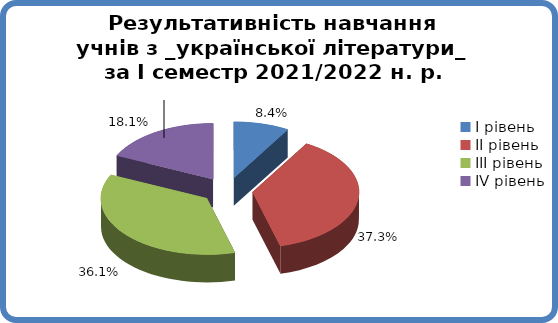
| Category | Series 0 |
|---|---|
| 0 | 0.084 |
| 1 | 0.373 |
| 2 | 0.361 |
| 3 | 0.181 |